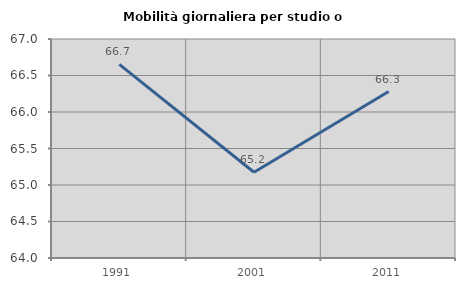
| Category | Mobilità giornaliera per studio o lavoro |
|---|---|
| 1991.0 | 66.653 |
| 2001.0 | 65.175 |
| 2011.0 | 66.28 |